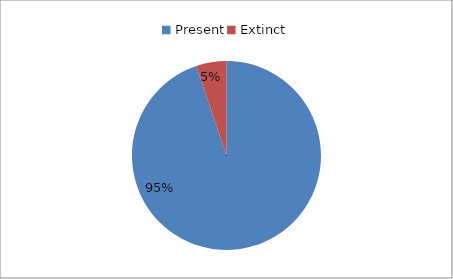
| Category | Series 0 |
|---|---|
| Present | 226 |
| Extinct | 12.389 |